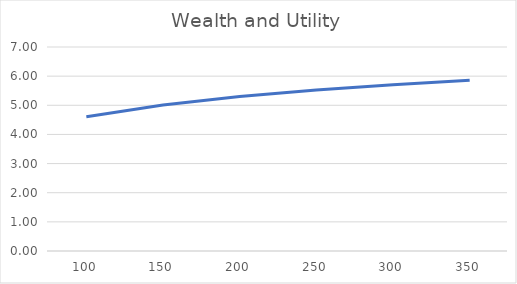
| Category | Utility |
|---|---|
| 100.0 | 4.605 |
| 150.0 | 5.011 |
| 200.0 | 5.298 |
| 250.0 | 5.521 |
| 300.0 | 5.704 |
| 350.0 | 5.858 |